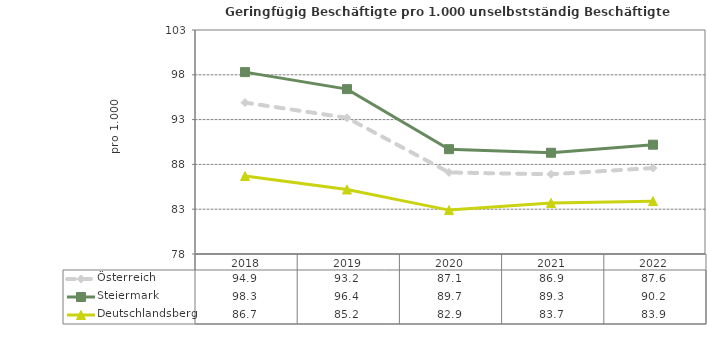
| Category | Österreich | Steiermark | Deutschlandsberg |
|---|---|---|---|
| 2022.0 | 87.6 | 90.2 | 83.9 |
| 2021.0 | 86.9 | 89.3 | 83.7 |
| 2020.0 | 87.1 | 89.7 | 82.9 |
| 2019.0 | 93.2 | 96.4 | 85.2 |
| 2018.0 | 94.9 | 98.3 | 86.7 |